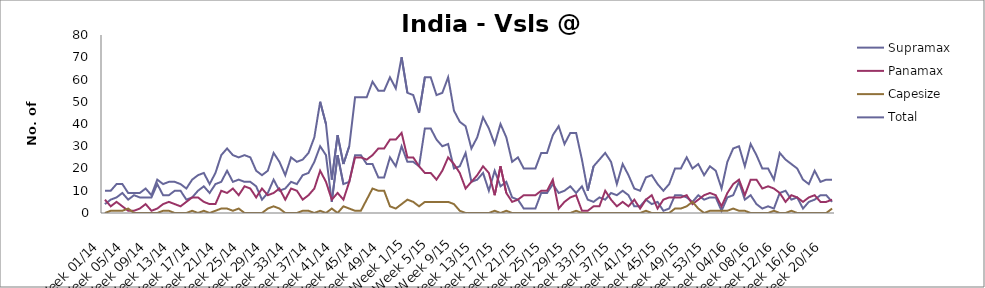
| Category | Supramax | Panamax | Capesize | Total |
|---|---|---|---|---|
| Week 01/14 | 4 | 6 | 0 | 10 |
| Week 02/14 | 6 | 3 | 1 | 10 |
| Week 03/14 | 7 | 5 | 1 | 13 |
| Week 04/14 | 9 | 3 | 1 | 13 |
| Week 05/14 | 6 | 1 | 2 | 9 |
| Week 06/14 | 8 | 1 | 0 | 9 |
| Week 07/14 | 7 | 2 | 0 | 9 |
| Week 08/14 | 7 | 4 | 0 | 11 |
| Week 09/14 | 7 | 1 | 0 | 8 |
| Week 10/14 | 13 | 2 | 0 | 15 |
| Week 11/14 | 8 | 4 | 1 | 13 |
| Week 12/14 | 8 | 5 | 1 | 14 |
| Week 13/14 | 10 | 4 | 0 | 14 |
| Week 14/14 | 10 | 3 | 0 | 13 |
| Week 15/14 | 6 | 5 | 0 | 11 |
| Week 16/14 | 7 | 7 | 1 | 15 |
| Week 17/14 | 10 | 7 | 0 | 17 |
| Week 18/14 | 12 | 5 | 1 | 18 |
| Week 19/14 | 9 | 4 | 0 | 13 |
| Week 20/14 | 13 | 4 | 1 | 18 |
| Week 21/14 | 14 | 10 | 2 | 26 |
| Week 22/14 | 19 | 9 | 2 | 29 |
| Week 23/14 | 14 | 11 | 1 | 26 |
| Week 24/14 | 15 | 8 | 2 | 25 |
| Week 25/14 | 14 | 12 | 0 | 26 |
| Week 26/14 | 14 | 11 | 0 | 25 |
| Week 27/14 | 12 | 7 | 0 | 19 |
| Week 28/14 | 6 | 11 | 0 | 17 |
| Week 29/14 | 9 | 8 | 2 | 19 |
| Week 30/14 | 15 | 9 | 3 | 27 |
| Week 31/14 | 10 | 11 | 2 | 23 |
| Week 32/14 | 11 | 6 | 0 | 17 |
| Week 33/14 | 14 | 11 | 0 | 25 |
| Week 34/14 | 13 | 10 | 0 | 23 |
| Week 35/14 | 17 | 6 | 1 | 24 |
| Week 36/14 | 18 | 8 | 1 | 27 |
| Week 37/14 | 23 | 11 | 0 | 34 |
| Week 38/14 | 30 | 19 | 1 | 50 |
| Week 39/14 | 26 | 14 | 0 | 40 |
| Week 40/14 | 5 | 6 | 2 | 15 |
| Week 41/14 | 26 | 9 | 0 | 35 |
| Week 42/14 | 13 | 6 | 3 | 22 |
| Week 43/14 | 14 | 14 | 2 | 30 |
| Week 44/14 | 26 | 25 | 1 | 52 |
| Week 45/14 | 26 | 25 | 1 | 52 |
| Week 46/14 | 22 | 24 | 6 | 52 |
| Week 47/14 | 22 | 26 | 11 | 59 |
| Week 48/14 | 16 | 29 | 10 | 55 |
| Week 49/14 | 16 | 29 | 10 | 55 |
| Week 50/14 | 25 | 33 | 3 | 61 |
| Week 51/14 | 21 | 33 | 2 | 56 |
| Week 52/14 | 30 | 36 | 4 | 70 |
| Week 1/15 | 23 | 25 | 6 | 54 |
| Week 2/15 | 23 | 25 | 5 | 53 |
| Week 3/15 | 21 | 21 | 3 | 45 |
| Week 4/15 | 38 | 18 | 5 | 61 |
| Week 5/15 | 38 | 18 | 5 | 61 |
| Week 6/15 | 33 | 15 | 5 | 53 |
| Week 7/15 | 30 | 19 | 5 | 54 |
| Week 8/15 | 31 | 25 | 5 | 61 |
| Week 9/15 | 20 | 22 | 4 | 46 |
| Week 10/15 | 21 | 18 | 1 | 41 |
| Week 11/15 | 27 | 11 | 0 | 39 |
| Week 12/15 | 14 | 14 | 0 | 29 |
| Week 13/15 | 15 | 17 | 0 | 34 |
| Week 14/15 | 18 | 21 | 0 | 43 |
| Week 15/15 | 10 | 18 | 0 | 38 |
| Week 16/15 | 19 | 8 | 1 | 31 |
| Week 17/15 | 12 | 21 | 0 | 40 |
| Week 18/15 | 14 | 9 | 1 | 34 |
| Week 19/15 | 7 | 5 | 0 | 23 |
| Week 20/15 | 6 | 6 | 0 | 25 |
| Week 21/15 | 2 | 8 | 0 | 20 |
| Week 22/15 | 2 | 8 | 0 | 20 |
| Week 23/15 | 2 | 8 | 0 | 20 |
| Week 24/15 | 9 | 10 | 0 | 27 |
| Week 25/15 | 9 | 10 | 0 | 27 |
| Week 26/15 | 13 | 15 | 0 | 35 |
| Week 27/15 | 9 | 2 | 0 | 39 |
| Week 28/15 | 10 | 5 | 0 | 31 |
| Week 29/15 | 12 | 7 | 0 | 36 |
| Week 30/15 | 9 | 8 | 1 | 36 |
| Week 31/15 | 12 | 1 | 0 | 24 |
| Week 32/15 | 6 | 1 | 0 | 10 |
| Week 33/15 | 5 | 3 | 0 | 21 |
| Week 34/15 | 7 | 3 | 0 | 24 |
| Week 35/15 | 6 | 10 | 0 | 27 |
| Week 36/15 | 9 | 6 | 0 | 23 |
| Week 37/15 | 8 | 3 | 0 | 13 |
| Week 38/15 | 10 | 5 | 0 | 22 |
| Week 39/15 | 8 | 3 | 0 | 17 |
| Week 40/15 | 3 | 6 | 0 | 11 |
| Week 41/15 | 3 | 2 | 0 | 10 |
| Week 42/15 | 6 | 6 | 1 | 16 |
| Week 43/15 | 4 | 8 | 0 | 17 |
| Week 44/15 | 5 | 2 | 0 | 13 |
| Week 45/15 | 1 | 6 | 0 | 10 |
| Week 46/15 | 2 | 7 | 0 | 13 |
| Week 47/15 | 8 | 7 | 2 | 20 |
| Week 48/15 | 8 | 7 | 2 | 20 |
| Week 49/15 | 7 | 8 | 3 | 25 |
| Week 50/15 | 5 | 4 | 5 | 20 |
| Week 51/15 | 8 | 6 | 2 | 22 |
| Week 52/15 | 6 | 8 | 0 | 17 |
| Week 53/15 | 7 | 9 | 1 | 21 |
| Week 01/16 | 7 | 8 | 1 | 19 |
| Week 02/16 | 1 | 3 | 1 | 11 |
| Week 03/16 | 7 | 9 | 1 | 23 |
| Week 04/16 | 8 | 13 | 2 | 29 |
| Week 05/16 | 14 | 15 | 1 | 30 |
| Week 06/16 | 6 | 8 | 1 | 21 |
| Week 07/16 | 8 | 15 | 0 | 31 |
| Week 08/16 | 4 | 15 | 0 | 26 |
| Week 09/16 | 2 | 11 | 0 | 20 |
| Week 10/16 | 3 | 12 | 0 | 20 |
| Week 11/16 | 2 | 11 | 1 | 15 |
| Week 12/16 | 9 | 9 | 0 | 27 |
| Week 13/16 | 10 | 5 | 0 | 24 |
| Week 14/16 | 6 | 8 | 1 | 22 |
| Week 15/16 | 7 | 7 | 0 | 20 |
| Week 16/16 | 2 | 5 | 0 | 15 |
| Week 17/16 | 5 | 7 | 0 | 13 |
| Week 18/16 | 6 | 8 | 0 | 19 |
| Week 19/16 | 8 | 5 | 0 | 14 |
| Week 20/16 | 8 | 5 | 0 | 15 |
| Week 21/16 | 5 | 6 | 2 | 15 |